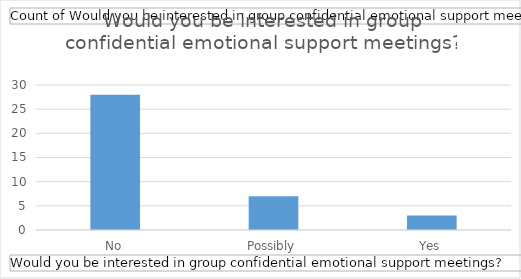
| Category | Total |
|---|---|
| No | 28 |
| Possibly | 7 |
| Yes | 3 |